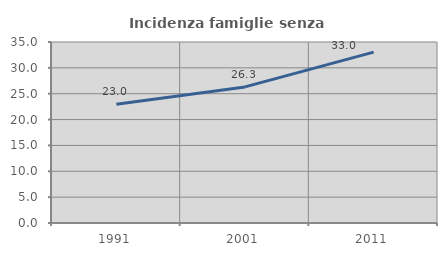
| Category | Incidenza famiglie senza nuclei |
|---|---|
| 1991.0 | 22.977 |
| 2001.0 | 26.316 |
| 2011.0 | 33.043 |